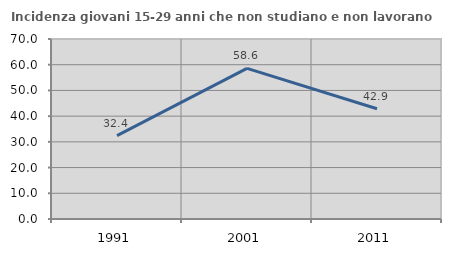
| Category | Incidenza giovani 15-29 anni che non studiano e non lavorano  |
|---|---|
| 1991.0 | 32.424 |
| 2001.0 | 58.576 |
| 2011.0 | 42.86 |